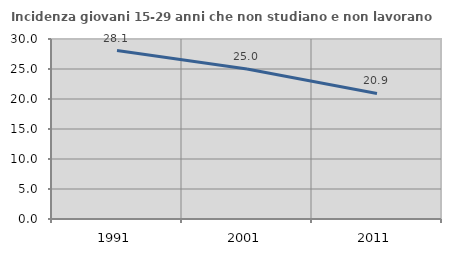
| Category | Incidenza giovani 15-29 anni che non studiano e non lavorano  |
|---|---|
| 1991.0 | 28.07 |
| 2001.0 | 25 |
| 2011.0 | 20.93 |